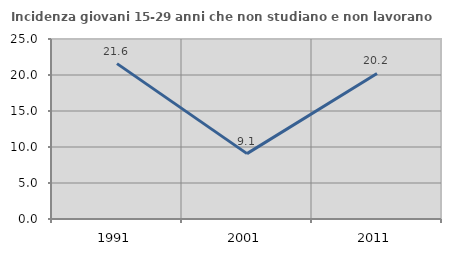
| Category | Incidenza giovani 15-29 anni che non studiano e non lavorano  |
|---|---|
| 1991.0 | 21.581 |
| 2001.0 | 9.078 |
| 2011.0 | 20.217 |